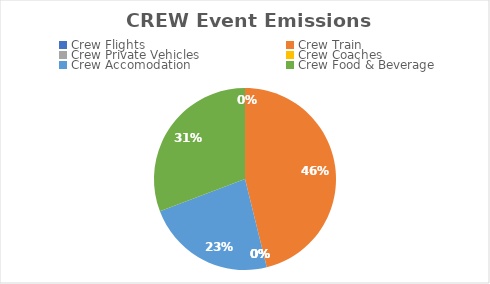
| Category | Series 0 |
|---|---|
| Crew Flights | 0 |
| Crew Train | 0.06 |
| Crew Private Vehicles | 0 |
| Crew Coaches | 0 |
| Crew Accomodation | 0.03 |
| Crew Food & Beverage | 0.04 |